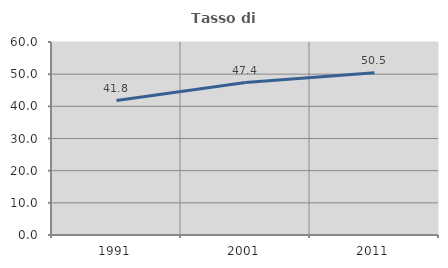
| Category | Tasso di occupazione   |
|---|---|
| 1991.0 | 41.793 |
| 2001.0 | 47.378 |
| 2011.0 | 50.46 |